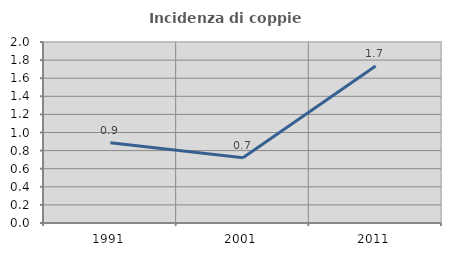
| Category | Incidenza di coppie miste |
|---|---|
| 1991.0 | 0.887 |
| 2001.0 | 0.722 |
| 2011.0 | 1.734 |